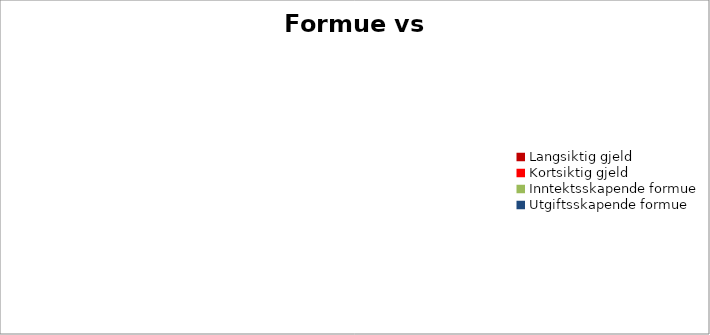
| Category | Series 0 |
|---|---|
| Langsiktig gjeld | 0 |
| Kortsiktig gjeld | 0 |
| Inntektsskapende formue | 0 |
| Utgiftsskapende formue | 0 |